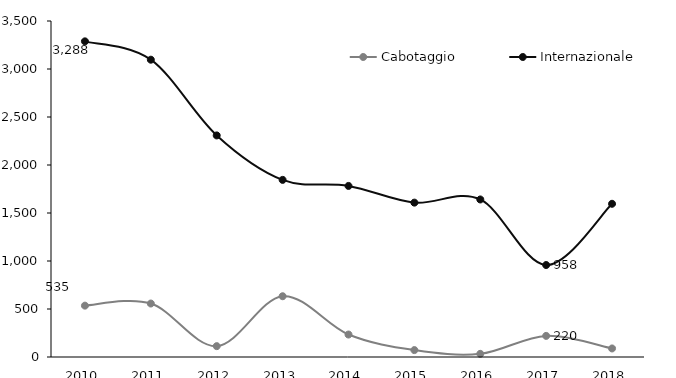
| Category | Cabotaggio | Internazionale |
|---|---|---|
| 2010.0 | 535 | 3288 |
| 2011.0 | 557 | 3097 |
| 2012.0 | 113 | 2308 |
| 2013.0 | 633 | 1845 |
| 2014.0 | 234 | 1782 |
| 2015.0 | 72 | 1608 |
| 2016.0 | 33 | 1641 |
| 2017.0 | 220 | 958 |
| 2018.0 | 89 | 1596 |